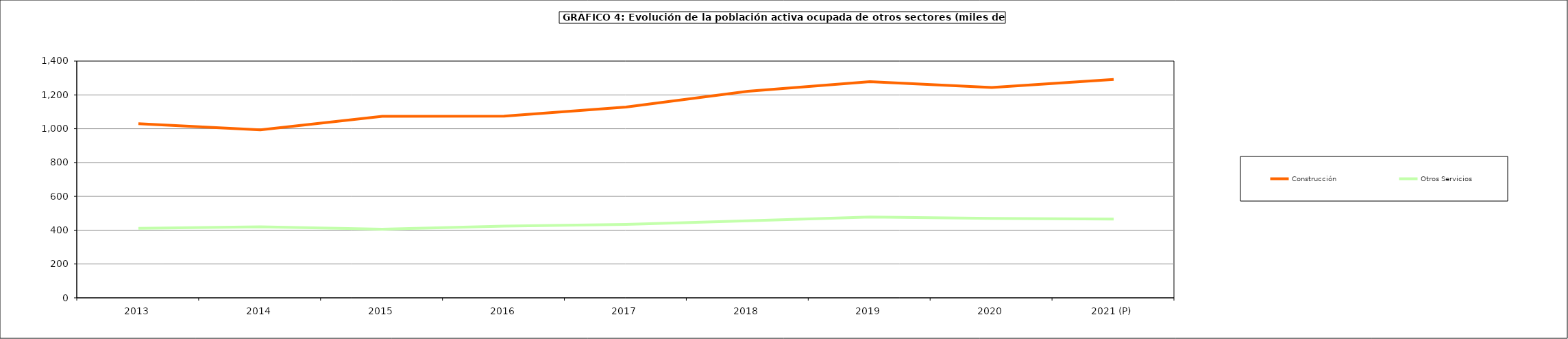
| Category | Construcción | Otros Servicios |
|---|---|---|
| 2013 | 1029.6 | 410.85 |
| 2014 | 993.5 | 419.6 |
| 2015 | 1073.65 | 405.475 |
| 2016 | 1073.9 | 424.325 |
| 2017 | 1128.3 | 434.6 |
| 2018 | 1221.8 | 455.3 |
| 2019 | 1277.9 | 477.775 |
| 2020 | 1244.075 | 469.65 |
| 2021 (P) | 1291.525 | 465.425 |